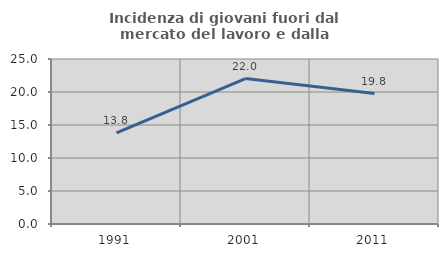
| Category | Incidenza di giovani fuori dal mercato del lavoro e dalla formazione  |
|---|---|
| 1991.0 | 13.793 |
| 2001.0 | 22.034 |
| 2011.0 | 19.767 |